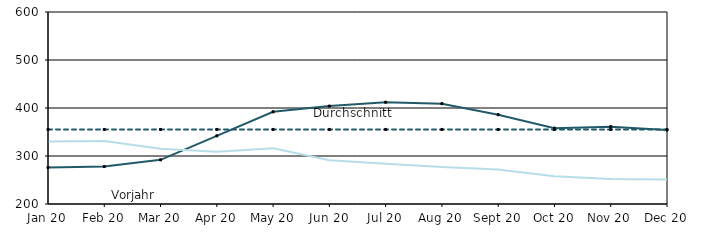
| Category | Berichtsjahr | Durchschnitt | Vorjahr |
|---|---|---|---|
| 2020-01-01 | 276 | 355.333 | 330 |
| 2020-02-01 | 278 | 355.333 | 331 |
| 2020-03-01 | 292 | 355.333 | 315 |
| 2020-04-01 | 342 | 355.333 | 309 |
| 2020-05-01 | 392 | 355.333 | 316 |
| 2020-06-01 | 404 | 355.333 | 291 |
| 2020-07-01 | 412 | 355.333 | 284 |
| 2020-08-01 | 409 | 355.333 | 277 |
| 2020-09-01 | 386 | 355.333 | 272 |
| 2020-10-01 | 358 | 355.333 | 258 |
| 2020-11-01 | 361 | 355.333 | 252 |
| 2020-12-01 | 354 | 355.333 | 251 |